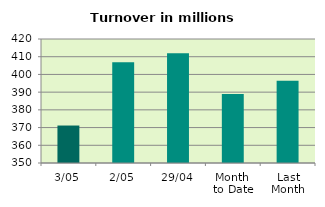
| Category | Series 0 |
|---|---|
| 3/05 | 371.153 |
| 2/05 | 406.843 |
| 29/04 | 412.001 |
| Month 
to Date | 388.998 |
| Last
Month | 396.429 |